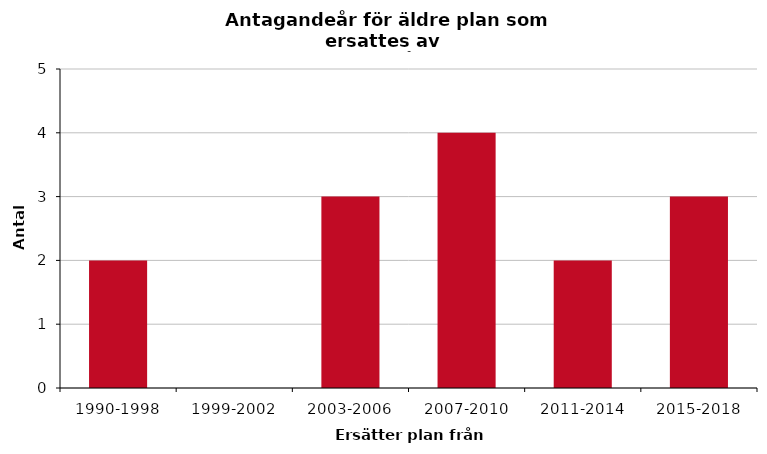
| Category | Antal planer |
|---|---|
| 1990-1998 | 2 |
| 1999-2002 | 0 |
| 2003-2006 | 3 |
| 2007-2010 | 4 |
| 2011-2014 | 2 |
| 2015-2018 | 3 |